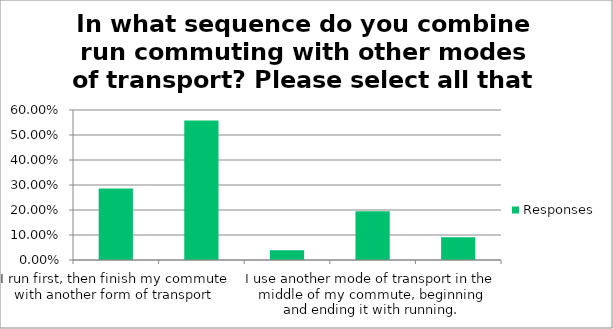
| Category | Responses |
|---|---|
| I run first, then finish my commute with another form of transport | 0.286 |
| I use another form of transport first, then finish my commute by running | 0.558 |
| I run in the middle of my commute, using other modes of transport at the beginning and the end | 0.039 |
| I use another mode of transport in the middle of my commute, beginning and ending it with running. | 0.195 |
| Other (please specify) | 0.091 |